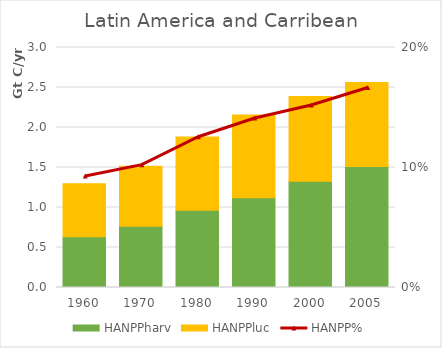
| Category | HANPPharv | HANPPluc |
|---|---|---|
| 1960.0 | 633822.251 | 664207.948 |
| 1970.0 | 766635.492 | 748324.15 |
| 1980.0 | 965240.151 | 915056.236 |
| 1990.0 | 1122213.129 | 1032673.657 |
| 2000.0 | 1328832.094 | 1057436.442 |
| 2005.0 | 1511410.698 | 1052269.052 |